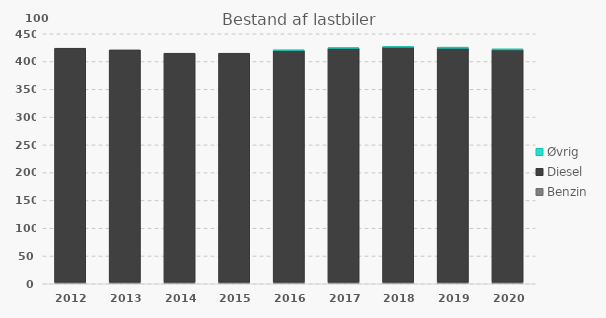
| Category | Benzin | Diesel | Øvrig |
|---|---|---|---|
| 2012 | 3 | 421 | 0 |
| 2013 | 3 | 418 | 0 |
| 2014 | 3 | 412 | 0 |
| 2015 | 3 | 412 | 0 |
| 2016 | 3 | 417 | 1 |
| 2017 | 3 | 421 | 1 |
| 2018 | 3 | 423 | 1 |
| 2019 | 3 | 421 | 2 |
| 2020 | 3 | 418 | 2 |